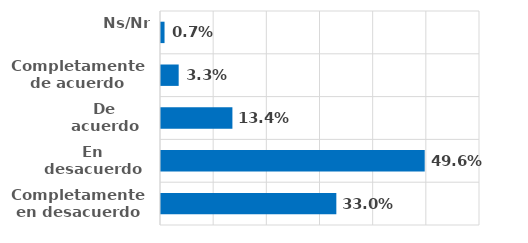
| Category | Series 0 |
|---|---|
| Completamente en desacuerdo | 0.33 |
| En desacuerdo | 0.496 |
| De acuerdo | 0.134 |
| Completamente de acuerdo | 0.033 |
| Ns/Nr | 0.007 |